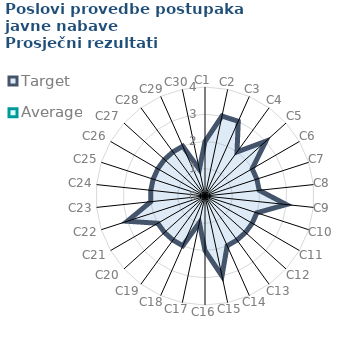
| Category | Target | Average |
|---|---|---|
| C1 | 2 | 0 |
| C2 | 3 | 0 |
| C3 | 3 | 0 |
| C4 | 2 | 0 |
| C5 | 3 | 0 |
| C6 | 2 | 0 |
| C7 | 2 | 0 |
| C8 | 2 | 0 |
| C9 | 3 | 0 |
| C10 | 2 | 0 |
| C11 | 2 | 0 |
| C12 | 2 | 0 |
| C13 | 2 | 0 |
| C14 | 2 | 0 |
| C15 | 3 | 0 |
| C16 | 2 | 0 |
| C17 | 1 | 0 |
| C18 | 2 | 0 |
| C19 | 2 | 0 |
| C20 | 2 | 0 |
| C21 | 2 | 0 |
| C22 | 3 | 0 |
| C23 | 2 | 0 |
| C24 | 2 | 0 |
| C25 | 2 | 0 |
| C26 | 2 | 0 |
| C27 | 2 | 0 |
| C28 | 2 | 0 |
| C29 | 2 | 0 |
| C30 | 1 | 0 |